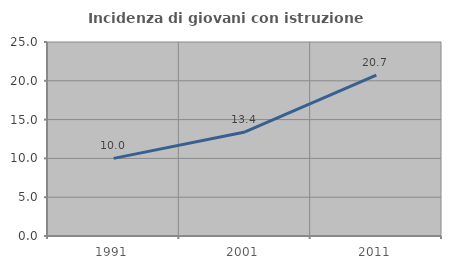
| Category | Incidenza di giovani con istruzione universitaria |
|---|---|
| 1991.0 | 10 |
| 2001.0 | 13.41 |
| 2011.0 | 20.734 |